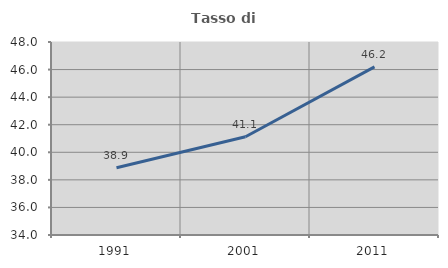
| Category | Tasso di occupazione   |
|---|---|
| 1991.0 | 38.879 |
| 2001.0 | 41.126 |
| 2011.0 | 46.193 |